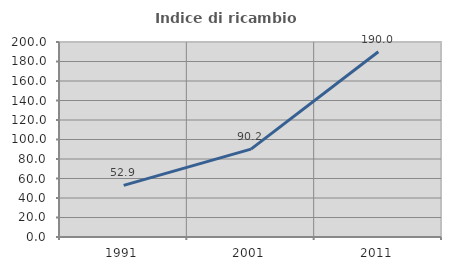
| Category | Indice di ricambio occupazionale  |
|---|---|
| 1991.0 | 52.941 |
| 2001.0 | 90.157 |
| 2011.0 | 190 |